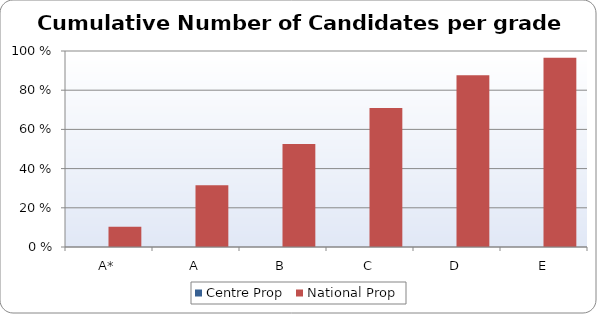
| Category | Centre Prop | National Prop |
|---|---|---|
| A* | 0 | 10.29 |
| A | 0 | 31.56 |
| B | 0 | 52.51 |
| C | 0 | 70.89 |
| D | 0 | 87.64 |
| E | 0 | 96.55 |